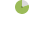
| Category | Datos |
|---|---|
| no | 50 |
| si | 200 |